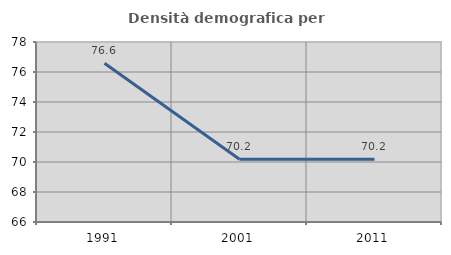
| Category | Densità demografica |
|---|---|
| 1991.0 | 76.589 |
| 2001.0 | 70.187 |
| 2011.0 | 70.187 |